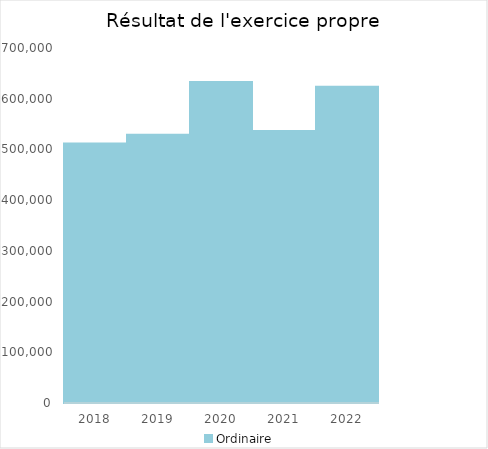
| Category |   | Ordinaire |    |
|---|---|---|---|
| 2018.0 |  | 511874.75 |  |
| 2019.0 |  | 528754.38 |  |
| 2020.0 |  | 633092.05 |  |
| 2021.0 |  | 536403.07 |  |
| 2022.0 |  | 623529.1 |  |